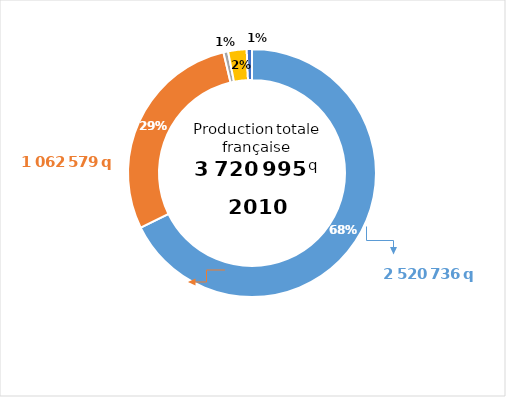
| Category | 2010 |
|---|---|
| Normandie | 2520736 |
| Hauts de France | 1062579 |
| Grand Est | 22460 |
| Île-de-France | 89756 |
| Autres régions | 25464 |